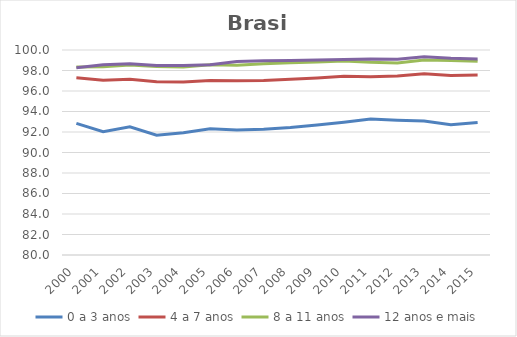
| Category | 0 a 3 anos | 4 a 7 anos | 8 a 11 anos | 12 anos e mais |
|---|---|---|---|---|
| 2000.0 | 92.846 | 97.301 | 98.351 | 98.27 |
| 2001.0 | 92.025 | 97.061 | 98.36 | 98.561 |
| 2002.0 | 92.508 | 97.148 | 98.525 | 98.669 |
| 2003.0 | 91.684 | 96.901 | 98.394 | 98.485 |
| 2004.0 | 91.924 | 96.867 | 98.352 | 98.49 |
| 2005.0 | 92.311 | 97.032 | 98.552 | 98.555 |
| 2006.0 | 92.183 | 96.992 | 98.52 | 98.876 |
| 2007.0 | 92.271 | 97.017 | 98.666 | 98.959 |
| 2008.0 | 92.439 | 97.136 | 98.766 | 98.987 |
| 2009.0 | 92.681 | 97.276 | 98.834 | 99.019 |
| 2010.0 | 92.962 | 97.441 | 98.936 | 99.077 |
| 2011.0 | 93.27 | 97.399 | 98.808 | 99.118 |
| 2012.0 | 93.145 | 97.458 | 98.741 | 99.098 |
| 2013.0 | 93.063 | 97.683 | 99.014 | 99.338 |
| 2014.0 | 92.697 | 97.509 | 98.967 | 99.201 |
| 2015.0 | 92.934 | 97.55 | 98.895 | 99.13 |